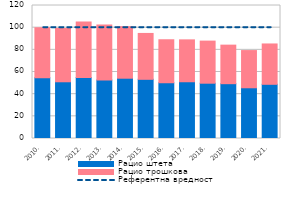
| Category | Рацио штета | Рацио трошкова |
|---|---|---|
| 2010. | 54.72 | 45.23 |
| 2011. | 51.18 | 48.09 |
| 2012. | 55 | 50.1 |
| 2013. | 52.8 | 49.6 |
| 2014. | 54.4 | 46.5 |
| 2015. | 53.4 | 41.4 |
| 2016. | 50.3 | 38.8 |
| 2017. | 51.2 | 37.8 |
| 2018. | 49.89 | 37.99 |
| 2019. | 49.46 | 34.78 |
| 2020. | 45.77 | 33.56 |
| 2021. | 48.9 | 36.4 |